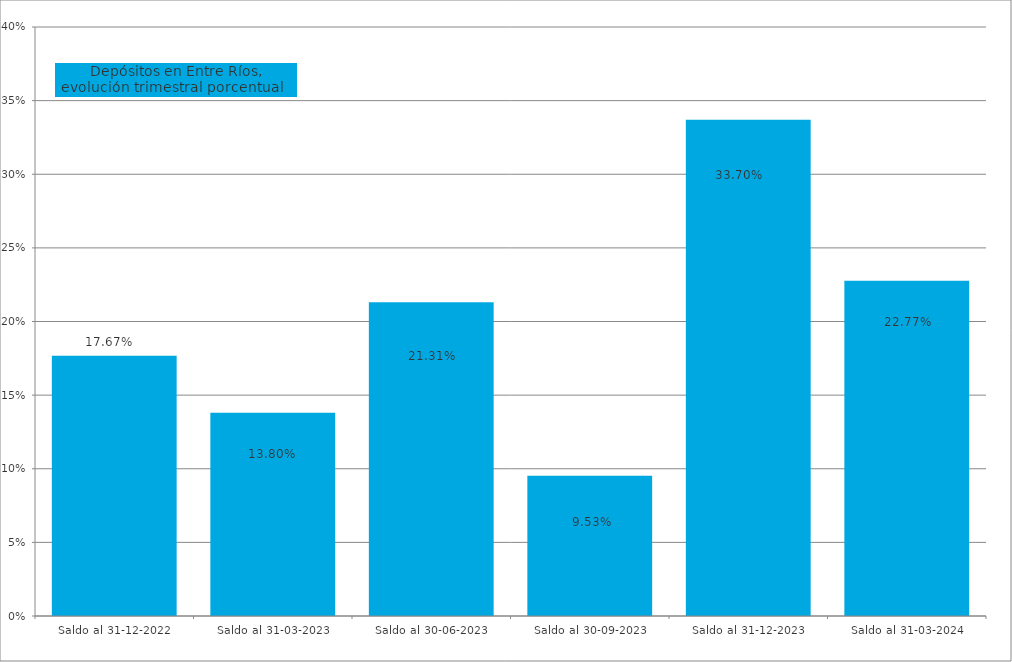
| Category | Series 0 |
|---|---|
| Saldo al 31-12-2022 | 0.177 |
| Saldo al 31-03-2023 | 0.138 |
| Saldo al 30-06-2023 | 0.213 |
| Saldo al 30-09-2023 | 0.095 |
| Saldo al 31-12-2023 | 0.337 |
| Saldo al 31-03-2024 | 0.228 |